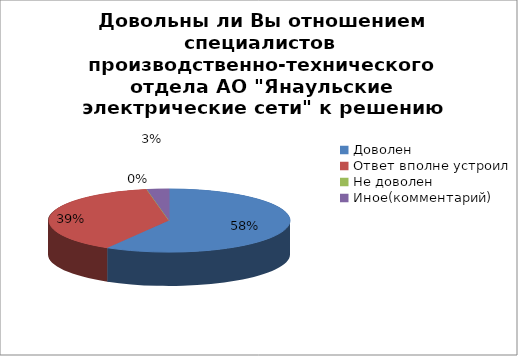
| Category | Довольны ли Вы отношением специалистов производственно-технического отдела АО "Янаульские электрические сети" к решению Вашего вопроса? |
|---|---|
| Доволен | 100 |
| Ответ вполне устроил | 66 |
| Не доволен | 0 |
| Иное(комментарий) | 5 |